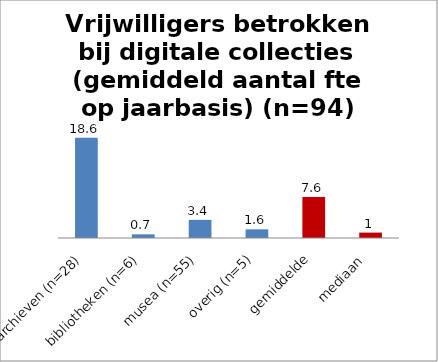
| Category | Gem. aantal fte |
|---|---|
| archieven (n=28) | 18.571 |
| bibliotheken (n=6) | 0.683 |
| musea (n=55) | 3.361 |
| overig (n=5) | 1.6 |
| gemiddelde | 7.6 |
| mediaan  | 1 |